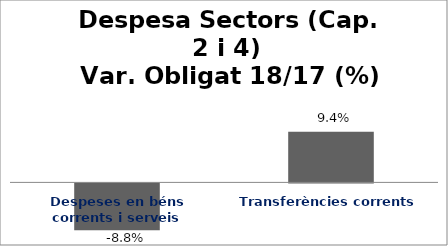
| Category | Series 0 |
|---|---|
| Despeses en béns corrents i serveis | -0.088 |
| Transferències corrents | 0.094 |